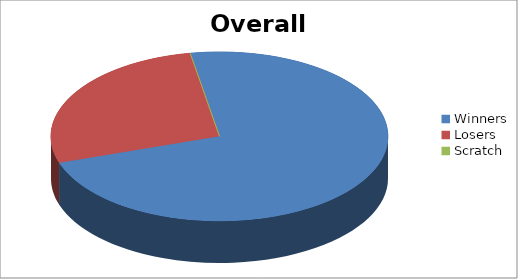
| Category | Series 1 |
|---|---|
| Winners | 24 |
| Losers | 9 |
| Scratch | 0 |